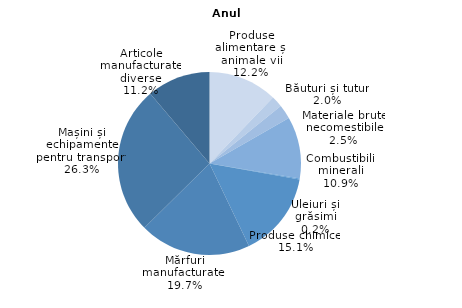
| Category | % |
|---|---|
| Produse alimentare și animale vii | 12.2 |
| Băuturi și tutun | 2 |
| Materiale brute necomestibile | 2.5 |
| Combustibili minerali | 10.9 |
| Uleiuri și grăsimi | 0.2 |
| Produse chimice  | 15.1 |
| Mărfuri manufacturate  | 19.7 |
| Mașini și echipamente pentru transport | 26.2 |
| Articole manufacturate diverse | 11.2 |